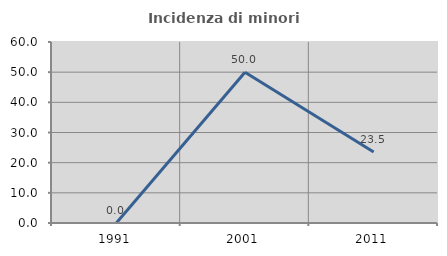
| Category | Incidenza di minori stranieri |
|---|---|
| 1991.0 | 0 |
| 2001.0 | 50 |
| 2011.0 | 23.529 |